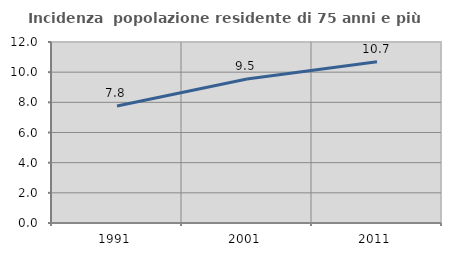
| Category | Incidenza  popolazione residente di 75 anni e più |
|---|---|
| 1991.0 | 7.755 |
| 2001.0 | 9.548 |
| 2011.0 | 10.694 |